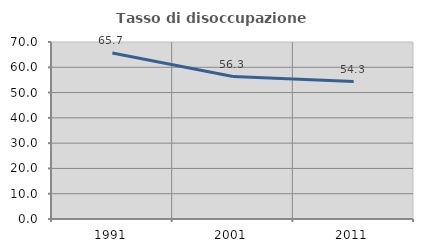
| Category | Tasso di disoccupazione giovanile  |
|---|---|
| 1991.0 | 65.659 |
| 2001.0 | 56.341 |
| 2011.0 | 54.348 |